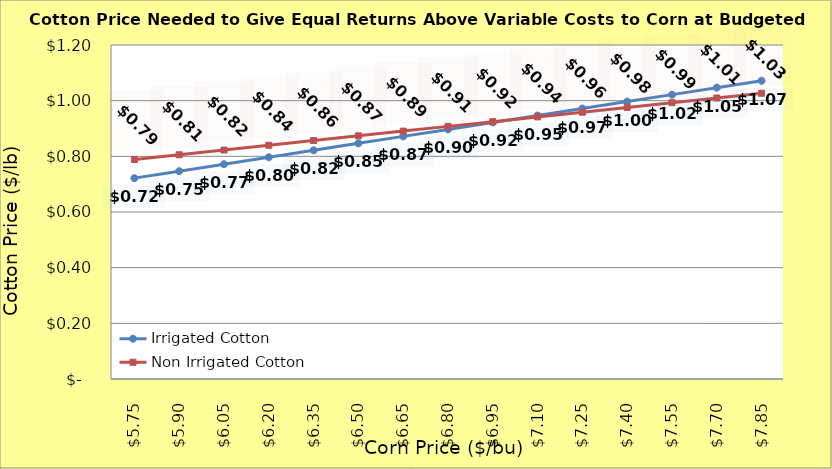
| Category | Irrigated Cotton | Non Irrigated Cotton |
|---|---|---|
| 5.749999999999997 | 0.722 | 0.789 |
| 5.899999999999998 | 0.747 | 0.806 |
| 6.049999999999998 | 0.772 | 0.823 |
| 6.199999999999998 | 0.797 | 0.84 |
| 6.349999999999999 | 0.822 | 0.857 |
| 6.499999999999999 | 0.847 | 0.874 |
| 6.6499999999999995 | 0.872 | 0.891 |
| 6.8 | 0.897 | 0.908 |
| 6.95 | 0.922 | 0.925 |
| 7.1000000000000005 | 0.947 | 0.942 |
| 7.250000000000001 | 0.972 | 0.959 |
| 7.400000000000001 | 0.997 | 0.976 |
| 7.550000000000002 | 1.022 | 0.993 |
| 7.700000000000002 | 1.047 | 1.01 |
| 7.850000000000002 | 1.072 | 1.027 |